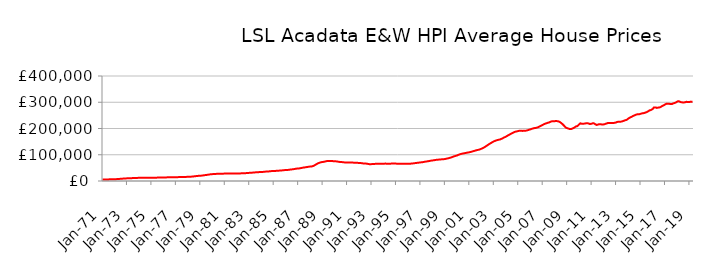
| Category | Series 0 |
|---|---|
| 1971-01-01 | 5724.052 |
| 1971-02-01 | 5764.727 |
| 1971-03-01 | 5805.744 |
| 1971-04-01 | 5859.071 |
| 1971-05-01 | 5947.568 |
| 1971-06-01 | 6039.787 |
| 1971-07-01 | 6153.189 |
| 1971-08-01 | 6276.583 |
| 1971-09-01 | 6398.993 |
| 1971-10-01 | 6526.163 |
| 1971-11-01 | 6663.446 |
| 1971-12-01 | 6830.612 |
| 1972-01-01 | 6946.64 |
| 1972-02-01 | 7022.605 |
| 1972-03-01 | 7195.52 |
| 1972-04-01 | 7437.32 |
| 1972-05-01 | 7786.685 |
| 1972-06-01 | 8093.256 |
| 1972-07-01 | 8445.732 |
| 1972-08-01 | 8785.754 |
| 1972-09-01 | 9085.99 |
| 1972-10-01 | 9366.58 |
| 1972-11-01 | 9626.405 |
| 1972-12-01 | 9894.445 |
| 1973-01-01 | 10086.196 |
| 1973-02-01 | 10221.683 |
| 1973-03-01 | 10377.44 |
| 1973-04-01 | 10555.106 |
| 1973-05-01 | 10782.895 |
| 1973-06-01 | 10930.891 |
| 1973-07-01 | 11085.888 |
| 1973-08-01 | 11257.829 |
| 1973-09-01 | 11458.488 |
| 1973-10-01 | 11666.531 |
| 1973-11-01 | 11825.075 |
| 1973-12-01 | 11938.765 |
| 1974-01-01 | 11999.742 |
| 1974-02-01 | 12065.461 |
| 1974-03-01 | 12062.768 |
| 1974-04-01 | 12036.729 |
| 1974-05-01 | 12013.752 |
| 1974-06-01 | 12014.589 |
| 1974-07-01 | 12026.272 |
| 1974-08-01 | 12065.491 |
| 1974-09-01 | 12136.837 |
| 1974-10-01 | 12224.473 |
| 1974-11-01 | 12297.099 |
| 1974-12-01 | 12368.8 |
| 1975-01-01 | 12401.972 |
| 1975-02-01 | 12443.817 |
| 1975-03-01 | 12518.081 |
| 1975-04-01 | 12623.827 |
| 1975-05-01 | 12752.207 |
| 1975-06-01 | 12820.938 |
| 1975-07-01 | 12888.334 |
| 1975-08-01 | 12981.389 |
| 1975-09-01 | 13107.324 |
| 1975-10-01 | 13247.24 |
| 1975-11-01 | 13370.433 |
| 1975-12-01 | 13502.183 |
| 1976-01-01 | 13594.945 |
| 1976-02-01 | 13682.301 |
| 1976-03-01 | 13742.074 |
| 1976-04-01 | 13805.651 |
| 1976-05-01 | 13888.833 |
| 1976-06-01 | 13943.255 |
| 1976-07-01 | 14003.455 |
| 1976-08-01 | 14092.549 |
| 1976-09-01 | 14220.052 |
| 1976-10-01 | 14363.748 |
| 1976-11-01 | 14478.728 |
| 1976-12-01 | 14581.408 |
| 1977-01-01 | 14638.5 |
| 1977-02-01 | 14704.068 |
| 1977-03-01 | 14746.584 |
| 1977-04-01 | 14796.452 |
| 1977-05-01 | 14873.475 |
| 1977-06-01 | 14943.32 |
| 1977-07-01 | 15029.197 |
| 1977-08-01 | 15146.978 |
| 1977-09-01 | 15291.017 |
| 1977-10-01 | 15453.279 |
| 1977-11-01 | 15624.938 |
| 1977-12-01 | 15849 |
| 1978-01-01 | 16015.39 |
| 1978-02-01 | 16145.255 |
| 1978-03-01 | 16320.261 |
| 1978-04-01 | 16555.686 |
| 1978-05-01 | 16933.102 |
| 1978-06-01 | 17315.025 |
| 1978-07-01 | 17776.942 |
| 1978-08-01 | 18250.744 |
| 1978-09-01 | 18706.734 |
| 1978-10-01 | 19160.153 |
| 1978-11-01 | 19582.961 |
| 1978-12-01 | 20000.721 |
| 1979-01-01 | 20249.228 |
| 1979-02-01 | 20415.907 |
| 1979-03-01 | 20831.095 |
| 1979-04-01 | 21400.214 |
| 1979-05-01 | 22126.495 |
| 1979-06-01 | 22587.387 |
| 1979-07-01 | 23065.762 |
| 1979-08-01 | 23604.455 |
| 1979-09-01 | 24249.836 |
| 1979-10-01 | 24938.747 |
| 1979-11-01 | 25512.34 |
| 1979-12-01 | 25958.028 |
| 1980-01-01 | 26202.72 |
| 1980-02-01 | 26392.91 |
| 1980-03-01 | 26636.942 |
| 1980-04-01 | 26922.685 |
| 1980-05-01 | 27256.94 |
| 1980-06-01 | 27435.742 |
| 1980-07-01 | 27597.878 |
| 1980-08-01 | 27747.714 |
| 1980-09-01 | 27853.364 |
| 1980-10-01 | 27921.018 |
| 1980-11-01 | 27973.017 |
| 1980-12-01 | 28083.641 |
| 1981-01-01 | 28149.402 |
| 1981-02-01 | 28249.159 |
| 1981-03-01 | 28349.185 |
| 1981-04-01 | 28483.438 |
| 1981-05-01 | 28619.554 |
| 1981-06-01 | 28665.734 |
| 1981-07-01 | 28687.757 |
| 1981-08-01 | 28693.199 |
| 1981-09-01 | 28639.156 |
| 1981-10-01 | 28540.531 |
| 1981-11-01 | 28449.988 |
| 1981-12-01 | 28440.131 |
| 1982-01-01 | 28396.186 |
| 1982-02-01 | 28415.433 |
| 1982-03-01 | 28573.016 |
| 1982-04-01 | 28838.513 |
| 1982-05-01 | 29135.915 |
| 1982-06-01 | 29244.445 |
| 1982-07-01 | 29326.329 |
| 1982-08-01 | 29482.476 |
| 1982-09-01 | 29735.669 |
| 1982-10-01 | 30036.483 |
| 1982-11-01 | 30336.175 |
| 1982-12-01 | 30707.835 |
| 1983-01-01 | 30990.247 |
| 1983-02-01 | 31232.959 |
| 1983-03-01 | 31485.859 |
| 1983-04-01 | 31799.274 |
| 1983-05-01 | 32210.334 |
| 1983-06-01 | 32532.911 |
| 1983-07-01 | 32884.142 |
| 1983-08-01 | 33217.828 |
| 1983-09-01 | 33484.567 |
| 1983-10-01 | 33702.791 |
| 1983-11-01 | 33908.719 |
| 1983-12-01 | 34179.18 |
| 1984-01-01 | 34340.828 |
| 1984-02-01 | 34504.946 |
| 1984-03-01 | 34816.545 |
| 1984-04-01 | 35248.792 |
| 1984-05-01 | 35743.59 |
| 1984-06-01 | 35962.963 |
| 1984-07-01 | 36146.557 |
| 1984-08-01 | 36426.283 |
| 1984-09-01 | 36872.65 |
| 1984-10-01 | 37389.081 |
| 1984-11-01 | 37788.221 |
| 1984-12-01 | 38065.626 |
| 1985-01-01 | 38142.632 |
| 1985-02-01 | 38249.055 |
| 1985-03-01 | 38510.694 |
| 1985-04-01 | 38878.195 |
| 1985-05-01 | 39297.821 |
| 1985-06-01 | 39459.982 |
| 1985-07-01 | 39609.899 |
| 1985-08-01 | 39869.781 |
| 1985-09-01 | 40303.194 |
| 1985-10-01 | 40798.184 |
| 1985-11-01 | 41214.216 |
| 1985-12-01 | 41546.956 |
| 1986-01-01 | 41676.289 |
| 1986-02-01 | 41808.343 |
| 1986-03-01 | 42194.079 |
| 1986-04-01 | 42752.059 |
| 1986-05-01 | 43448.482 |
| 1986-06-01 | 43870.111 |
| 1986-07-01 | 44301.132 |
| 1986-08-01 | 44815.67 |
| 1986-09-01 | 45462.382 |
| 1986-10-01 | 46160.79 |
| 1986-11-01 | 46794.738 |
| 1986-12-01 | 47385.809 |
| 1987-01-01 | 47728.735 |
| 1987-02-01 | 48012.679 |
| 1987-03-01 | 48628.588 |
| 1987-04-01 | 49457.847 |
| 1987-05-01 | 50448.678 |
| 1987-06-01 | 51007.765 |
| 1987-07-01 | 51542.618 |
| 1987-08-01 | 52131.235 |
| 1987-09-01 | 52770.168 |
| 1987-10-01 | 53431.581 |
| 1987-11-01 | 54051.264 |
| 1987-12-01 | 54693.136 |
| 1988-01-01 | 54998.269 |
| 1988-02-01 | 55261.433 |
| 1988-03-01 | 56181.853 |
| 1988-04-01 | 57567.018 |
| 1988-05-01 | 59651.186 |
| 1988-06-01 | 61754.283 |
| 1988-07-01 | 64230.632 |
| 1988-08-01 | 66508.571 |
| 1988-09-01 | 68262.579 |
| 1988-10-01 | 69718.912 |
| 1988-11-01 | 70890.185 |
| 1988-12-01 | 71930.099 |
| 1989-01-01 | 72473.695 |
| 1989-02-01 | 72933.253 |
| 1989-03-01 | 73713.269 |
| 1989-04-01 | 74706.375 |
| 1989-05-01 | 75758.491 |
| 1989-06-01 | 76218.182 |
| 1989-07-01 | 76531.16 |
| 1989-08-01 | 76677.894 |
| 1989-09-01 | 76551.393 |
| 1989-10-01 | 76197.409 |
| 1989-11-01 | 75726.489 |
| 1989-12-01 | 75342.662 |
| 1990-01-01 | 74997.209 |
| 1990-02-01 | 74983.033 |
| 1990-03-01 | 74468.301 |
| 1990-04-01 | 73800.231 |
| 1990-05-01 | 73019.079 |
| 1990-06-01 | 72646.325 |
| 1990-07-01 | 72328.69 |
| 1990-08-01 | 72019.086 |
| 1990-09-01 | 71584.02 |
| 1990-10-01 | 71086.736 |
| 1990-11-01 | 70625.213 |
| 1990-12-01 | 70429.161 |
| 1991-01-01 | 70291.343 |
| 1991-02-01 | 70365.195 |
| 1991-03-01 | 70253.325 |
| 1991-04-01 | 70179.426 |
| 1991-05-01 | 70082.158 |
| 1991-06-01 | 70038.63 |
| 1991-07-01 | 69992.377 |
| 1991-08-01 | 69927.492 |
| 1991-09-01 | 69816.431 |
| 1991-10-01 | 69617.764 |
| 1991-11-01 | 69292.362 |
| 1991-12-01 | 68948.205 |
| 1992-01-01 | 68607.347 |
| 1992-02-01 | 68555.077 |
| 1992-03-01 | 68076.952 |
| 1992-04-01 | 67499.842 |
| 1992-05-01 | 66862.788 |
| 1992-06-01 | 66654.255 |
| 1992-07-01 | 66504.32 |
| 1992-08-01 | 66189.656 |
| 1992-09-01 | 65518.05 |
| 1992-10-01 | 64684.723 |
| 1992-11-01 | 64119.825 |
| 1992-12-01 | 64136.269 |
| 1993-01-01 | 64294.945 |
| 1993-02-01 | 64575.741 |
| 1993-03-01 | 64828.051 |
| 1993-04-01 | 65143.693 |
| 1993-05-01 | 65412.799 |
| 1993-06-01 | 65443.582 |
| 1993-07-01 | 65463.054 |
| 1993-08-01 | 65516.954 |
| 1993-09-01 | 65475.951 |
| 1993-10-01 | 65357.973 |
| 1993-11-01 | 65280.77 |
| 1993-12-01 | 65509.301 |
| 1994-01-01 | 65823.679 |
| 1994-02-01 | 66215.591 |
| 1994-03-01 | 66200.652 |
| 1994-04-01 | 66040.858 |
| 1994-05-01 | 65900.526 |
| 1994-06-01 | 65913.104 |
| 1994-07-01 | 65992.304 |
| 1994-08-01 | 66155.2 |
| 1994-09-01 | 66414.12 |
| 1994-10-01 | 66727.801 |
| 1994-11-01 | 66876.257 |
| 1994-12-01 | 66788.676 |
| 1995-01-01 | 66299.285 |
| 1995-02-01 | 65878.008 |
| 1995-03-01 | 65719.605 |
| 1995-04-01 | 65554.552 |
| 1995-05-01 | 65582.512 |
| 1995-06-01 | 65443.379 |
| 1995-07-01 | 65586.036 |
| 1995-08-01 | 65649.397 |
| 1995-09-01 | 65686.864 |
| 1995-10-01 | 65663.319 |
| 1995-11-01 | 65746.116 |
| 1995-12-01 | 65826.774 |
| 1996-01-01 | 65850.653 |
| 1996-02-01 | 65810.587 |
| 1996-03-01 | 66028.038 |
| 1996-04-01 | 66284.657 |
| 1996-05-01 | 66772.208 |
| 1996-06-01 | 67129.112 |
| 1996-07-01 | 67711.942 |
| 1996-08-01 | 68275.864 |
| 1996-09-01 | 68845.613 |
| 1996-10-01 | 69260.464 |
| 1996-11-01 | 69700.306 |
| 1996-12-01 | 70322.263 |
| 1997-01-01 | 70768.381 |
| 1997-02-01 | 71243.642 |
| 1997-03-01 | 71649.555 |
| 1997-04-01 | 72308.33 |
| 1997-05-01 | 73168.819 |
| 1997-06-01 | 73822.225 |
| 1997-07-01 | 74283.52 |
| 1997-08-01 | 75018.824 |
| 1997-09-01 | 75676.696 |
| 1997-10-01 | 76528.781 |
| 1997-11-01 | 77124.603 |
| 1997-12-01 | 77881.3 |
| 1998-01-01 | 78330.231 |
| 1998-02-01 | 79004.394 |
| 1998-03-01 | 79592.47 |
| 1998-04-01 | 80322.56 |
| 1998-05-01 | 80841.191 |
| 1998-06-01 | 81159.809 |
| 1998-07-01 | 81541.341 |
| 1998-08-01 | 81898.34 |
| 1998-09-01 | 82259.693 |
| 1998-10-01 | 82499.46 |
| 1998-11-01 | 82779.197 |
| 1998-12-01 | 83115.498 |
| 1999-01-01 | 83613.265 |
| 1999-02-01 | 84607.397 |
| 1999-03-01 | 85483.743 |
| 1999-04-01 | 86353.108 |
| 1999-05-01 | 87305.138 |
| 1999-06-01 | 88312.28 |
| 1999-07-01 | 89497.981 |
| 1999-08-01 | 91032.635 |
| 1999-09-01 | 92597.032 |
| 1999-10-01 | 94034.378 |
| 1999-11-01 | 95010.364 |
| 1999-12-01 | 96321.288 |
| 2000-01-01 | 97366.774 |
| 2000-02-01 | 99251.532 |
| 2000-03-01 | 100730.988 |
| 2000-04-01 | 102308.236 |
| 2000-05-01 | 103106.757 |
| 2000-06-01 | 104085.675 |
| 2000-07-01 | 104959.016 |
| 2000-08-01 | 105772.797 |
| 2000-09-01 | 106528.421 |
| 2000-10-01 | 107304.612 |
| 2000-11-01 | 107943.909 |
| 2000-12-01 | 108757.874 |
| 2001-01-01 | 109417.271 |
| 2001-02-01 | 110440.317 |
| 2001-03-01 | 111397.347 |
| 2001-04-01 | 112573.02 |
| 2001-05-01 | 113841.339 |
| 2001-06-01 | 114892.733 |
| 2001-07-01 | 116039.556 |
| 2001-08-01 | 117182.64 |
| 2001-09-01 | 118217.849 |
| 2001-10-01 | 118912.764 |
| 2001-11-01 | 120098.452 |
| 2001-12-01 | 121411.939 |
| 2002-01-01 | 123166.767 |
| 2002-02-01 | 124871.682 |
| 2002-03-01 | 126908.869 |
| 2002-04-01 | 129102.371 |
| 2002-05-01 | 131578.986 |
| 2002-06-01 | 134087.286 |
| 2002-07-01 | 136833.825 |
| 2002-08-01 | 139273.788 |
| 2002-09-01 | 141863.407 |
| 2002-10-01 | 144288.693 |
| 2002-11-01 | 146419.218 |
| 2002-12-01 | 148765.121 |
| 2003-01-01 | 150857.648 |
| 2003-02-01 | 152575.228 |
| 2003-03-01 | 153963.556 |
| 2003-04-01 | 155291.778 |
| 2003-05-01 | 156419.19 |
| 2003-06-01 | 157325.604 |
| 2003-07-01 | 158124.52 |
| 2003-08-01 | 159695.266 |
| 2003-09-01 | 161335.594 |
| 2003-10-01 | 163479.587 |
| 2003-11-01 | 165561.004 |
| 2003-12-01 | 167304.174 |
| 2004-01-01 | 169237.373 |
| 2004-02-01 | 171569.665 |
| 2004-03-01 | 173826.226 |
| 2004-04-01 | 175870.599 |
| 2004-05-01 | 178091.302 |
| 2004-06-01 | 180200.731 |
| 2004-07-01 | 182234.825 |
| 2004-08-01 | 184303.51 |
| 2004-09-01 | 185935.388 |
| 2004-10-01 | 187601.536 |
| 2004-11-01 | 188503.108 |
| 2004-12-01 | 189492.009 |
| 2005-01-01 | 190271.849 |
| 2005-02-01 | 191414.961 |
| 2005-03-01 | 191307.384 |
| 2005-04-01 | 191385.931 |
| 2005-05-01 | 190789.147 |
| 2005-06-01 | 191309.844 |
| 2005-07-01 | 191319.555 |
| 2005-08-01 | 191569.071 |
| 2005-09-01 | 192146.589 |
| 2005-10-01 | 193274.487 |
| 2005-11-01 | 194204.629 |
| 2005-12-01 | 195787.179 |
| 2006-01-01 | 196789.447 |
| 2006-02-01 | 198441.023 |
| 2006-03-01 | 199612.645 |
| 2006-04-01 | 200830.649 |
| 2006-05-01 | 201614.139 |
| 2006-06-01 | 202207.347 |
| 2006-07-01 | 203075.969 |
| 2006-08-01 | 204234.21 |
| 2006-09-01 | 205945.735 |
| 2006-10-01 | 207990.011 |
| 2006-11-01 | 209617.09 |
| 2006-12-01 | 211765.837 |
| 2007-01-01 | 213538.029 |
| 2007-02-01 | 216107.841 |
| 2007-03-01 | 217479.29 |
| 2007-04-01 | 219272.042 |
| 2007-05-01 | 220315.078 |
| 2007-06-01 | 222009.115 |
| 2007-07-01 | 222687.123 |
| 2007-08-01 | 224460.722 |
| 2007-09-01 | 226227.808 |
| 2007-10-01 | 227540.609 |
| 2007-11-01 | 227284.839 |
| 2007-12-01 | 227433.413 |
| 2008-01-01 | 227827.129 |
| 2008-02-01 | 228741.432 |
| 2008-03-01 | 228118.902 |
| 2008-04-01 | 227674.481 |
| 2008-05-01 | 226200.506 |
| 2008-06-01 | 224434.589 |
| 2008-07-01 | 221197.984 |
| 2008-08-01 | 218181.885 |
| 2008-09-01 | 214541.399 |
| 2008-10-01 | 210634.505 |
| 2008-11-01 | 206130.652 |
| 2008-12-01 | 202930.031 |
| 2009-01-01 | 201447.291 |
| 2009-02-01 | 200195.627 |
| 2009-03-01 | 198543.307 |
| 2009-04-01 | 197695.062 |
| 2009-05-01 | 198115.164 |
| 2009-06-01 | 199629.16 |
| 2009-07-01 | 201223.033 |
| 2009-08-01 | 203501.941 |
| 2009-09-01 | 206187.319 |
| 2009-10-01 | 208584.386 |
| 2009-11-01 | 209002.713 |
| 2009-12-01 | 213111.81 |
| 2010-01-01 | 216322.861 |
| 2010-02-01 | 219924.872 |
| 2010-03-01 | 218537.513 |
| 2010-04-01 | 217809.916 |
| 2010-05-01 | 217968.902 |
| 2010-06-01 | 218732.691 |
| 2010-07-01 | 219353.324 |
| 2010-08-01 | 220110.662 |
| 2010-09-01 | 220078.897 |
| 2010-10-01 | 219216.311 |
| 2010-11-01 | 217612.082 |
| 2010-12-01 | 217601.628 |
| 2011-01-01 | 218123.147 |
| 2011-02-01 | 219783.244 |
| 2011-03-01 | 219987.92 |
| 2011-04-01 | 217896.56 |
| 2011-05-01 | 215070.552 |
| 2011-06-01 | 213541.473 |
| 2011-07-01 | 214581.343 |
| 2011-08-01 | 216103.808 |
| 2011-09-01 | 216078.388 |
| 2011-10-01 | 216350.889 |
| 2011-11-01 | 215125.515 |
| 2011-12-01 | 215194.364 |
| 2012-01-01 | 215889.202 |
| 2012-02-01 | 216649.949 |
| 2012-03-01 | 218490.049 |
| 2012-04-01 | 219309.105 |
| 2012-05-01 | 221366.338 |
| 2012-06-01 | 221374.859 |
| 2012-07-01 | 221152.402 |
| 2012-08-01 | 220672.565 |
| 2012-09-01 | 220892.388 |
| 2012-10-01 | 221300.28 |
| 2012-11-01 | 221404.715 |
| 2012-12-01 | 222092.485 |
| 2013-01-01 | 222828.062 |
| 2013-02-01 | 224736.007 |
| 2013-03-01 | 225563.602 |
| 2013-04-01 | 226164.103 |
| 2013-05-01 | 225918.187 |
| 2013-06-01 | 226228.04 |
| 2013-07-01 | 227080.324 |
| 2013-08-01 | 228563.69 |
| 2013-09-01 | 230019.564 |
| 2013-10-01 | 231440.016 |
| 2013-11-01 | 232463.672 |
| 2013-12-01 | 234563.62 |
| 2014-01-01 | 237782.418 |
| 2014-02-01 | 240132.395 |
| 2014-03-01 | 242575.432 |
| 2014-04-01 | 243916.58 |
| 2014-05-01 | 246293.59 |
| 2014-06-01 | 248306.816 |
| 2014-07-01 | 249917.641 |
| 2014-08-01 | 251785.869 |
| 2014-09-01 | 253228.454 |
| 2014-10-01 | 254149.034 |
| 2014-11-01 | 254163.788 |
| 2014-12-01 | 254509.495 |
| 2015-01-01 | 255974.307 |
| 2015-02-01 | 257239.904 |
| 2015-03-01 | 257907.417 |
| 2015-04-01 | 258526.388 |
| 2015-05-01 | 259614.599 |
| 2015-06-01 | 261047.351 |
| 2015-07-01 | 262197.133 |
| 2015-08-01 | 264709.142 |
| 2015-09-01 | 266706.424 |
| 2015-10-01 | 269488.987 |
| 2015-11-01 | 270061.523 |
| 2015-12-01 | 272125.761 |
| 2016-01-01 | 274297.09 |
| 2016-02-01 | 279967.268 |
| 2016-03-01 | 280440.433 |
| 2016-04-01 | 280424.799 |
| 2016-05-01 | 278466.737 |
| 2016-06-01 | 279398.104 |
| 2016-07-01 | 279790.631 |
| 2016-08-01 | 280598.995 |
| 2016-09-01 | 282384.739 |
| 2016-10-01 | 285117.626 |
| 2016-11-01 | 286918.623 |
| 2016-12-01 | 289050.604 |
| 2017-01-01 | 291359.006 |
| 2017-02-01 | 293203.029 |
| 2017-03-01 | 294763.389 |
| 2017-04-01 | 294643.941 |
| 2017-05-01 | 294453.692 |
| 2017-06-01 | 293250.247 |
| 2017-07-01 | 293035.545 |
| 2017-08-01 | 293434.325 |
| 2017-09-01 | 295305.22 |
| 2017-10-01 | 296747.036 |
| 2017-11-01 | 297984.694 |
| 2017-12-01 | 299990.723 |
| 2018-01-01 | 302466.641 |
| 2018-02-01 | 303993.62 |
| 2018-03-01 | 303295.63 |
| 2018-04-01 | 301432.562 |
| 2018-05-01 | 299996.01 |
| 2018-06-01 | 299563.941 |
| 2018-07-01 | 298764.409 |
| 2018-08-01 | 299477.143 |
| 2018-09-01 | 300008.376 |
| 2018-10-01 | 301929.777 |
| 2018-11-01 | 300644.219 |
| 2018-12-01 | 300659.775 |
| 2019-01-01 | 300696.327 |
| 2019-02-01 | 302374.197 |
| 2019-03-01 | 302301.768 |
| 2019-04-01 | 302121.619 |